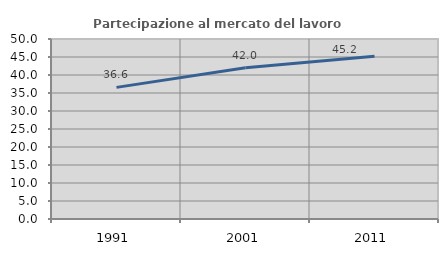
| Category | Partecipazione al mercato del lavoro  femminile |
|---|---|
| 1991.0 | 36.563 |
| 2001.0 | 41.993 |
| 2011.0 | 45.223 |